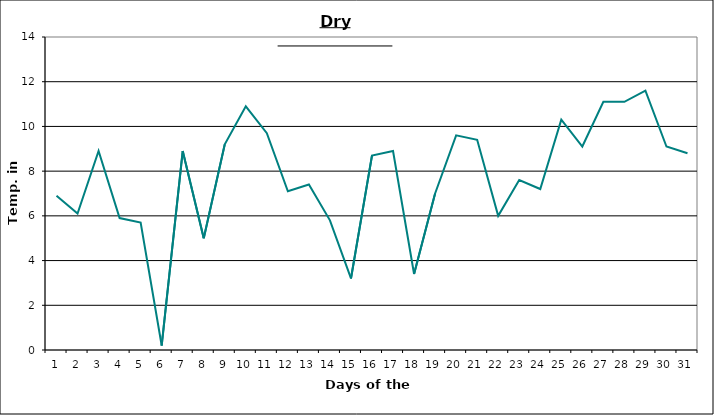
| Category | Series 0 |
|---|---|
| 0 | 6.9 |
| 1 | 6.1 |
| 2 | 8.9 |
| 3 | 5.9 |
| 4 | 5.7 |
| 5 | 0.2 |
| 6 | 8.9 |
| 7 | 5 |
| 8 | 9.2 |
| 9 | 10.9 |
| 10 | 9.7 |
| 11 | 7.1 |
| 12 | 7.4 |
| 13 | 5.8 |
| 14 | 3.2 |
| 15 | 8.7 |
| 16 | 8.9 |
| 17 | 3.4 |
| 18 | 7 |
| 19 | 9.6 |
| 20 | 9.4 |
| 21 | 6 |
| 22 | 7.6 |
| 23 | 7.2 |
| 24 | 10.3 |
| 25 | 9.1 |
| 26 | 11.1 |
| 27 | 11.1 |
| 28 | 11.6 |
| 29 | 9.1 |
| 30 | 8.8 |